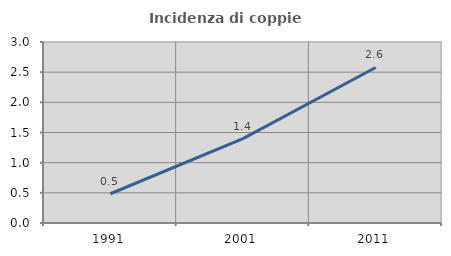
| Category | Incidenza di coppie miste |
|---|---|
| 1991.0 | 0.485 |
| 2001.0 | 1.399 |
| 2011.0 | 2.578 |